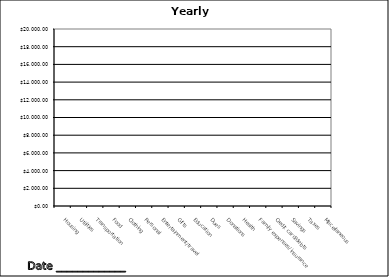
| Category | Series 0 |
|---|---|
| Housing | 0 |
| Utilities | 0 |
| Transportation | 0 |
| Food | 0 |
| Clothing | 0 |
| Personal  | 0 |
| Entertainment/travel | 0 |
| Gifts | 0 |
| Education | 0 |
| Dues | 0 |
| Donations | 0 |
| Health | 0 |
| Family expenses/insurance | 0 |
| Credit card/debts | 0 |
| Savings | 0 |
| Taxes | 0 |
| Miscellaneous | 0 |